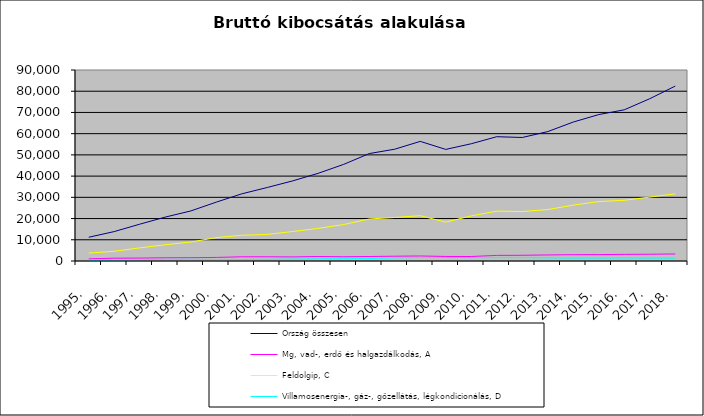
| Category | Ország összesen | Mg, vad-, erdő és halgazdálkodás, A | Feldolgip, C | Villamosenergia-, gáz-, gőzellátás, légkondicionálás, D |
|---|---|---|---|---|
| 1995. | 11194.873 | 1018.91 | 3718.144 | 379.339 |
| 1996. | 13866.01 | 1312.69 | 4584.172 | 485.332 |
| 1997. | 17349.723 | 1378.239 | 6191.768 | 634.958 |
| 1998. | 20685.002 | 1514.662 | 7657.001 | 751.769 |
| 1999. | 23577.947 | 1560.679 | 8921.557 | 789.63 |
| 2000. | 27736.762 | 1679.344 | 11030.183 | 662.086 |
| 2001. | 31644.531 | 1986.085 | 12112.305 | 694.949 |
| 2002. | 34638.827 | 1981.114 | 12521.535 | 776.791 |
| 2003. | 37759.095 | 1914.649 | 13900.12 | 871.36 |
| 2004. | 41332.24 | 2118.12 | 15387.512 | 1041.513 |
| 2005. | 45542.374 | 2001.974 | 17181.703 | 1107.144 |
| 2006. | 50619.717 | 2119.99 | 19800.33 | 1156.452 |
| 2007. | 52685.612 | 2253.601 | 20494.904 | 1476.18 |
| 2008. | 56364.102 | 2368.988 | 21357.359 | 1646.954 |
| 2009. | 52582.588 | 2140.539 | 18311.238 | 1642.276 |
| 2010. | 55250.149 | 2118.199 | 21251.286 | 1610.019 |
| 2011. | 58564.075 | 2640.347 | 23498.184 | 1583.112 |
| 2012. | 58205.084 | 2693.132 | 23304.511 | 1610.304 |
| 2013. | 60974.48 | 2854.71 | 24240.689 | 1479.859 |
| 2014. | 65477.238 | 2969.528 | 26322.177 | 1383.835 |
| 2015. | 68998.944 | 3014.249 | 27996.919 | 1388.332 |
| 2016. | 71237.373 | 3123.077 | 28602.192 | 1454.38 |
| 2017. | 76462.126 | 3190.059 | 30114.472 | 1366.501 |
| 2018. | 82429.053 | 3320.048 | 31654.373 | 1365.573 |